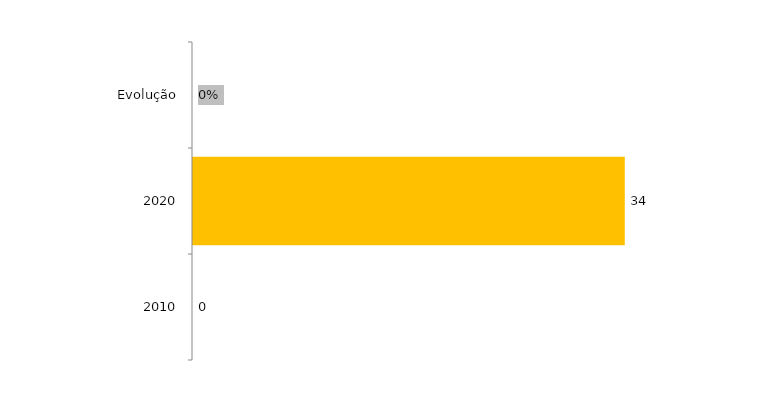
| Category | Evolução Concluintes |
|---|---|
| 2010 | 0 |
| 2020 | 34 |
| Evolução | 0 |